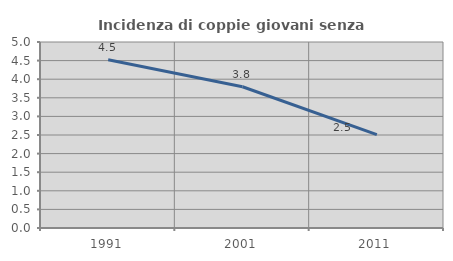
| Category | Incidenza di coppie giovani senza figli |
|---|---|
| 1991.0 | 4.521 |
| 2001.0 | 3.797 |
| 2011.0 | 2.511 |